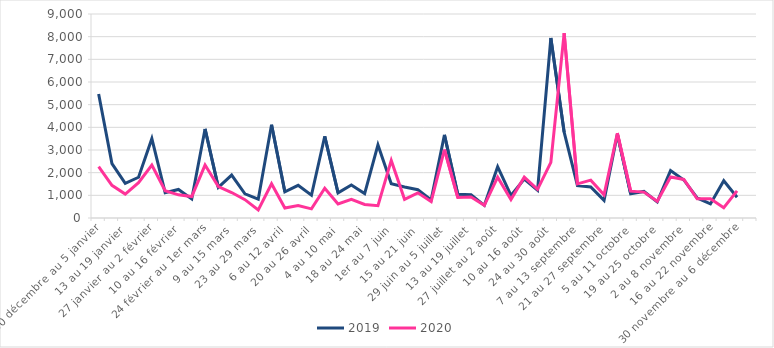
| Category | 2019 | 2020 |
|---|---|---|
| 30 décembre au 5 janvier | 5470 | 2264 |
| 6 au 12 janvier | 2401 | 1440 |
| 13 au 19 janvier | 1527 | 1054 |
| 20 au 26 janvier | 1797 | 1556 |
| 27 janvier au 2 février | 3500 | 2334 |
| 3 au 9 février | 1116 | 1204 |
| 10 au 16 février | 1260 | 1022 |
| 17 au 23 février | 842 | 948 |
| 24 février au 1er mars | 3929 | 2335 |
| 2 au 8 mars | 1349 | 1390 |
| 9 au 15 mars | 1894 | 1123 |
| 16 au 22 mars | 1068 | 810 |
| 23 au 29 mars | 828 | 352 |
| 30 mars au 5 avril | 4112 | 1512 |
| 6 au 12 avril | 1157 | 441 |
| 13 au 19 avril | 1441 | 545 |
| 20 au 26 avril | 1004 | 404 |
| 27 avril au 3 mai | 3605 | 1316 |
| 4 au 10 mai | 1107 | 620 |
| 11 au 17 mai | 1456 | 819 |
| 18 au 24 mai | 1077 | 598 |
| 25 au 31 mai | 3223 | 541 |
| 1er au 7 juin | 1515 | 2540 |
| 8 au 14 juin | 1371 | 823 |
| 15 au 21 juin | 1250 | 1109 |
| 22 au 28 juin | 799 | 725 |
| 29 juin au 5 juillet | 3668 | 3020 |
| 6 au 12 juillet | 1051 | 908 |
| 13 au 19 juillet | 1026 | 926 |
| 20 au 26 juillet | 558 | 559 |
| 27 juillet au 2 août | 2265 | 1800 |
| 3 au 9 août | 995 | 816 |
| 10 au 16 août | 1714 | 1802 |
| 17 au 23 août | 1221 | 1266 |
| 24 au 30 août | 7941 | 2453 |
| 31 août au 6 septembre | 3788 | 8152 |
| 7 au 13 septembre | 1432 | 1506 |
| 14 au 20 septembre | 1366 | 1670 |
| 21 au 27 septembre | 777 | 1022 |
| 28 septembre au 4 octobre | 3696 | 3741 |
| 5 au 11 octobre | 1073 | 1183 |
| 12 au 18 octobre | 1171 | 1142 |
| 19 au 25 octobre | 712 | 735 |
| 26 octobre au 1er novembre | 2091 | 1808 |
| 2 au 8 novembre | 1678 | 1700 |
| 9 au 15 novembre | 886 | 850 |
| 16 au 22 novembre | 623 | 854 |
| 23 au 29 novembre | 1643 | 451 |
| 30 novembre au 6 décembre | 914 | 1198 |